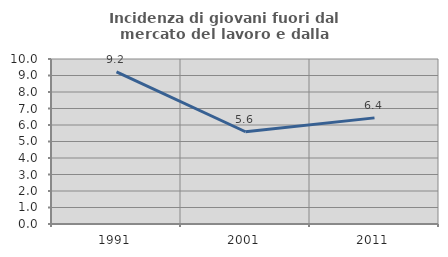
| Category | Incidenza di giovani fuori dal mercato del lavoro e dalla formazione  |
|---|---|
| 1991.0 | 9.222 |
| 2001.0 | 5.59 |
| 2011.0 | 6.432 |